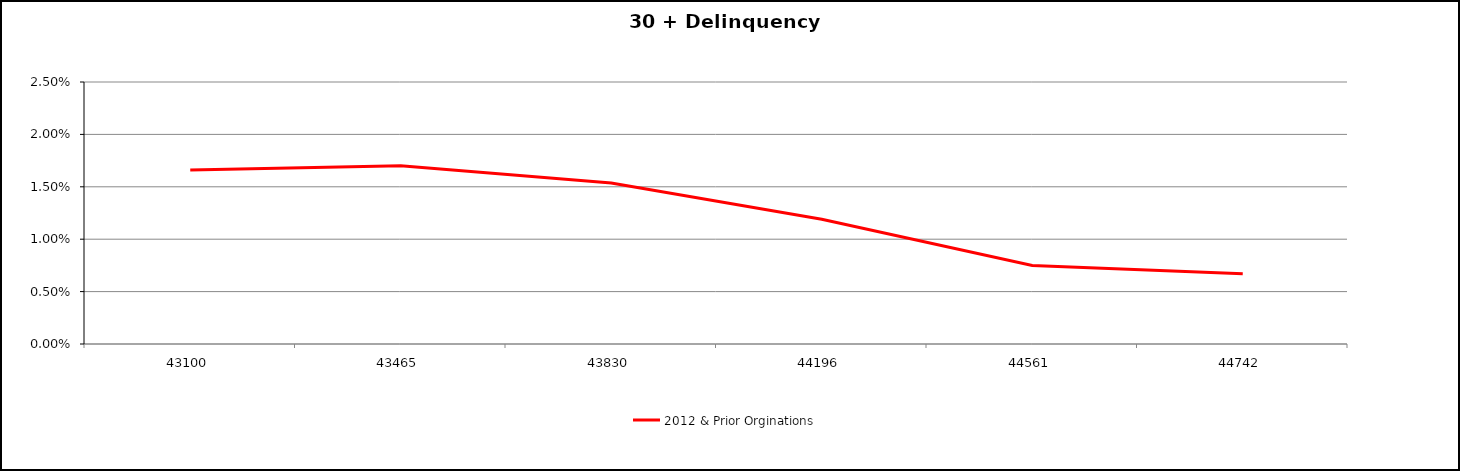
| Category | 2012 & Prior Orginations  |
|---|---|
| 2017-12-31 | 0.017 |
| 2018-12-31 | 0.017 |
| 2019-12-31 | 0.015 |
| 2020-12-31 | 0.012 |
| 2021-12-31 | 0.008 |
| 2022-06-30 | 0.007 |